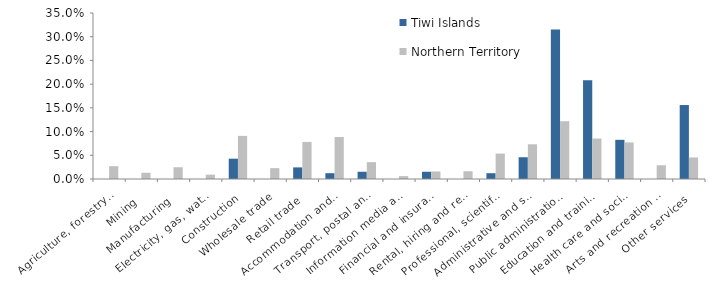
| Category | Tiwi Islands | Northern Territory |
|---|---|---|
| Agriculture, forestry and fishing | 0 | 0.027 |
| Mining | 0 | 0.013 |
| Manufacturing | 0 | 0.025 |
| Electricity, gas, water and waste services | 0 | 0.009 |
| Construction | 0.043 | 0.091 |
| Wholesale trade | 0 | 0.023 |
| Retail trade | 0.024 | 0.078 |
| Accommodation and food services | 0.012 | 0.089 |
| Transport, postal and warehousing | 0.015 | 0.036 |
| Information media and telecommunications | 0 | 0.006 |
| Financial and insurance services | 0.015 | 0.016 |
| Rental, hiring and real estate services | 0 | 0.016 |
| Professional, scientific and technical services | 0.012 | 0.054 |
| Administrative and support services | 0.046 | 0.073 |
| Public administration and safety | 0.315 | 0.122 |
| Education and training | 0.208 | 0.085 |
| Health care and social assistance | 0.083 | 0.077 |
| Arts and recreation services | 0 | 0.029 |
| Other services | 0.156 | 0.045 |